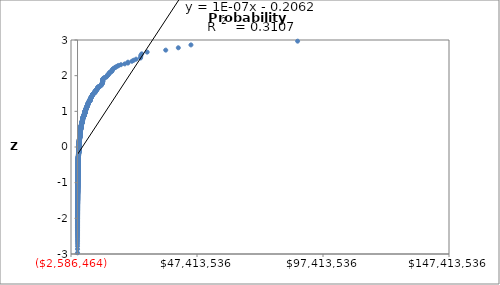
| Category | Normal Plot |
|---|---|
| 387.0 | -3.431 |
| 1362.0 | -3.121 |
| 1650.0 | -2.967 |
| 1860.0 | -2.862 |
| 5000.0 | -2.782 |
| 5000.0 | -2.716 |
| 5000.0 | -2.66 |
| 5000.0 | -2.612 |
| 5333.0 | -2.569 |
| 6000.0 | -2.53 |
| 7500.0 | -2.495 |
| 7629.0 | -2.462 |
| 9950.0 | -2.432 |
| 9999.0 | -2.404 |
| 10000.0 | -2.378 |
| 10000.0 | -2.353 |
| 10000.0 | -2.33 |
| 10000.0 | -2.308 |
| 10000.0 | -2.287 |
| 10000.0 | -2.266 |
| 10000.0 | -2.247 |
| 10000.0 | -2.229 |
| 10000.0 | -2.211 |
| 10000.0 | -2.194 |
| 10000.0 | -2.178 |
| 10000.0 | -2.162 |
| 10000.0 | -2.147 |
| 10000.0 | -2.132 |
| 10000.0 | -2.117 |
| 10000.0 | -2.103 |
| 10000.0 | -2.09 |
| 10000.0 | -2.077 |
| 10000.0 | -2.064 |
| 10000.0 | -2.051 |
| 10500.0 | -2.039 |
| 10500.0 | -2.027 |
| 12000.0 | -2.016 |
| 12327.0 | -2.004 |
| 13512.0 | -1.993 |
| 14657.0 | -1.982 |
| 14670.0 | -1.972 |
| 15000.0 | -1.961 |
| 15000.0 | -1.951 |
| 15213.0 | -1.941 |
| 15461.0 | -1.931 |
| 16100.0 | -1.922 |
| 17240.0 | -1.912 |
| 18750.0 | -1.903 |
| 19000.0 | -1.894 |
| 19490.0 | -1.885 |
| 20000.0 | -1.876 |
| 20000.0 | -1.867 |
| 20000.0 | -1.859 |
| 20000.0 | -1.85 |
| 21000.0 | -1.842 |
| 21000.0 | -1.834 |
| 21080.0 | -1.826 |
| 21563.0 | -1.818 |
| 22263.0 | -1.81 |
| 23000.0 | -1.802 |
| 23476.0 | -1.795 |
| 25000.0 | -1.787 |
| 25000.0 | -1.78 |
| 25000.0 | -1.773 |
| 25000.0 | -1.766 |
| 25000.0 | -1.758 |
| 25000.0 | -1.751 |
| 25000.0 | -1.744 |
| 25000.0 | -1.738 |
| 25000.0 | -1.731 |
| 25000.0 | -1.724 |
| 25000.0 | -1.718 |
| 25000.0 | -1.711 |
| 25000.0 | -1.704 |
| 25000.0 | -1.698 |
| 25000.0 | -1.692 |
| 25000.0 | -1.686 |
| 25000.0 | -1.679 |
| 26724.0 | -1.673 |
| 27473.0 | -1.667 |
| 27500.0 | -1.661 |
| 27727.0 | -1.655 |
| 27890.0 | -1.649 |
| 27945.0 | -1.643 |
| 30000.0 | -1.638 |
| 30000.0 | -1.632 |
| 30000.0 | -1.626 |
| 30000.0 | -1.621 |
| 30000.0 | -1.615 |
| 30250.0 | -1.609 |
| 35000.0 | -1.604 |
| 35000.0 | -1.599 |
| 35000.0 | -1.593 |
| 36018.0 | -1.588 |
| 36540.0 | -1.583 |
| 36540.0 | -1.577 |
| 38420.0 | -1.572 |
| 39280.0 | -1.567 |
| 39600.0 | -1.562 |
| 39900.0 | -1.557 |
| 40000.0 | -1.552 |
| 40000.0 | -1.547 |
| 40000.0 | -1.542 |
| 40000.0 | -1.537 |
| 40000.0 | -1.532 |
| 40100.0 | -1.527 |
| 40282.0 | -1.522 |
| 42000.0 | -1.518 |
| 42186.0 | -1.513 |
| 42500.0 | -1.508 |
| 47810.0 | -1.503 |
| 47902.0 | -1.499 |
| 48449.0 | -1.494 |
| 48907.0 | -1.49 |
| 49500.0 | -1.485 |
| 49531.0 | -1.481 |
| 49949.0 | -1.476 |
| 49996.0 | -1.472 |
| 50000.0 | -1.467 |
| 50000.0 | -1.463 |
| 50000.0 | -1.458 |
| 50000.0 | -1.454 |
| 50000.0 | -1.45 |
| 50000.0 | -1.445 |
| 50000.0 | -1.441 |
| 50000.0 | -1.437 |
| 50000.0 | -1.433 |
| 50000.0 | -1.428 |
| 50000.0 | -1.424 |
| 50000.0 | -1.42 |
| 50000.0 | -1.416 |
| 50000.0 | -1.412 |
| 50000.0 | -1.408 |
| 50000.0 | -1.404 |
| 50000.0 | -1.4 |
| 50000.0 | -1.396 |
| 50000.0 | -1.392 |
| 50000.0 | -1.388 |
| 50000.0 | -1.384 |
| 50000.0 | -1.38 |
| 50000.0 | -1.376 |
| 50000.0 | -1.372 |
| 50000.0 | -1.368 |
| 50000.0 | -1.365 |
| 50000.0 | -1.361 |
| 50000.0 | -1.357 |
| 50000.0 | -1.353 |
| 50000.0 | -1.349 |
| 50388.0 | -1.346 |
| 50527.0 | -1.342 |
| 51500.0 | -1.338 |
| 51700.0 | -1.335 |
| 53500.0 | -1.331 |
| 54000.0 | -1.327 |
| 56245.0 | -1.324 |
| 59100.0 | -1.32 |
| 60000.0 | -1.317 |
| 60000.0 | -1.313 |
| 60000.0 | -1.309 |
| 60000.0 | -1.306 |
| 60000.0 | -1.302 |
| 60614.0 | -1.299 |
| 61929.0 | -1.295 |
| 63300.0 | -1.292 |
| 64518.0 | -1.288 |
| 65000.0 | -1.285 |
| 66400.0 | -1.282 |
| 68500.0 | -1.278 |
| 68800.0 | -1.275 |
| 70000.0 | -1.271 |
| 70116.0 | -1.268 |
| 71166.0 | -1.265 |
| 74219.0 | -1.261 |
| 74290.0 | -1.258 |
| 74800.0 | -1.255 |
| 74871.0 | -1.251 |
| 74900.0 | -1.248 |
| 74963.0 | -1.245 |
| 74998.0 | -1.242 |
| 75000.0 | -1.238 |
| 75000.0 | -1.235 |
| 75000.0 | -1.232 |
| 75000.0 | -1.229 |
| 75000.0 | -1.225 |
| 75000.0 | -1.222 |
| 75000.0 | -1.219 |
| 75000.0 | -1.216 |
| 75000.0 | -1.213 |
| 75000.0 | -1.21 |
| 75000.0 | -1.206 |
| 75000.0 | -1.203 |
| 75000.0 | -1.2 |
| 75000.0 | -1.197 |
| 75000.0 | -1.194 |
| 75000.0 | -1.191 |
| 75000.0 | -1.188 |
| 75820.0 | -1.185 |
| 75970.0 | -1.182 |
| 77367.0 | -1.179 |
| 78200.0 | -1.176 |
| 79115.0 | -1.173 |
| 80000.0 | -1.17 |
| 80000.0 | -1.167 |
| 80000.0 | -1.164 |
| 80426.0 | -1.161 |
| 81000.0 | -1.158 |
| 82500.0 | -1.155 |
| 82800.0 | -1.152 |
| 85000.0 | -1.149 |
| 85000.0 | -1.146 |
| 86000.0 | -1.143 |
| 87028.0 | -1.141 |
| 88000.0 | -1.138 |
| 90000.0 | -1.135 |
| 90000.0 | -1.132 |
| 91200.0 | -1.129 |
| 91300.0 | -1.126 |
| 93000.0 | -1.123 |
| 93452.0 | -1.121 |
| 94500.0 | -1.118 |
| 96000.0 | -1.115 |
| 98223.0 | -1.112 |
| 99080.0 | -1.109 |
| 99400.0 | -1.107 |
| 99500.0 | -1.104 |
| 99858.0 | -1.101 |
| 99902.0 | -1.098 |
| 99964.0 | -1.096 |
| 99998.0 | -1.093 |
| 99999.0 | -1.09 |
| 100000.0 | -1.087 |
| 100000.0 | -1.085 |
| 100000.0 | -1.082 |
| 100000.0 | -1.079 |
| 100000.0 | -1.077 |
| 100000.0 | -1.074 |
| 100000.0 | -1.071 |
| 100000.0 | -1.069 |
| 100000.0 | -1.066 |
| 100000.0 | -1.063 |
| 100000.0 | -1.061 |
| 100000.0 | -1.058 |
| 100000.0 | -1.055 |
| 100000.0 | -1.053 |
| 100000.0 | -1.05 |
| 100000.0 | -1.047 |
| 100000.0 | -1.045 |
| 100000.0 | -1.042 |
| 100000.0 | -1.04 |
| 100000.0 | -1.037 |
| 100000.0 | -1.035 |
| 100000.0 | -1.032 |
| 100000.0 | -1.029 |
| 100000.0 | -1.027 |
| 100000.0 | -1.024 |
| 100000.0 | -1.022 |
| 100000.0 | -1.019 |
| 100000.0 | -1.017 |
| 100000.0 | -1.014 |
| 100000.0 | -1.012 |
| 100000.0 | -1.009 |
| 100000.0 | -1.007 |
| 100000.0 | -1.004 |
| 100000.0 | -1.002 |
| 100000.0 | -0.999 |
| 100000.0 | -0.997 |
| 100000.0 | -0.994 |
| 100000.0 | -0.992 |
| 100000.0 | -0.989 |
| 100000.0 | -0.987 |
| 100000.0 | -0.984 |
| 100000.0 | -0.982 |
| 100000.0 | -0.98 |
| 100000.0 | -0.977 |
| 100000.0 | -0.975 |
| 100000.0 | -0.972 |
| 100001.0 | -0.97 |
| 100001.0 | -0.967 |
| 100007.0 | -0.965 |
| 100034.0 | -0.963 |
| 100098.0 | -0.96 |
| 100239.0 | -0.958 |
| 103000.0 | -0.955 |
| 104000.0 | -0.953 |
| 105000.0 | -0.951 |
| 110000.0 | -0.948 |
| 110000.0 | -0.946 |
| 110610.0 | -0.944 |
| 110700.0 | -0.941 |
| 111042.0 | -0.939 |
| 111376.0 | -0.937 |
| 115000.0 | -0.934 |
| 115000.0 | -0.932 |
| 115000.0 | -0.93 |
| 115650.0 | -0.927 |
| 119823.0 | -0.925 |
| 120458.0 | -0.923 |
| 121638.0 | -0.92 |
| 122213.0 | -0.918 |
| 122404.0 | -0.916 |
| 122981.0 | -0.914 |
| 124200.0 | -0.911 |
| 124757.0 | -0.909 |
| 125000.0 | -0.907 |
| 125000.0 | -0.904 |
| 125000.0 | -0.902 |
| 125000.0 | -0.9 |
| 125000.0 | -0.898 |
| 125000.0 | -0.895 |
| 125000.0 | -0.893 |
| 125000.0 | -0.891 |
| 125104.0 | -0.889 |
| 125962.0 | -0.886 |
| 129150.0 | -0.884 |
| 131250.0 | -0.882 |
| 131417.0 | -0.88 |
| 132000.0 | -0.878 |
| 132907.0 | -0.875 |
| 134000.0 | -0.873 |
| 134281.0 | -0.871 |
| 135000.0 | -0.869 |
| 135001.0 | -0.867 |
| 136400.0 | -0.864 |
| 137500.0 | -0.862 |
| 139438.0 | -0.86 |
| 139950.0 | -0.858 |
| 140000.0 | -0.856 |
| 140000.0 | -0.853 |
| 140000.0 | -0.851 |
| 143600.0 | -0.849 |
| 143973.0 | -0.847 |
| 144650.0 | -0.845 |
| 144917.0 | -0.843 |
| 146221.0 | -0.841 |
| 146337.0 | -0.838 |
| 147920.0 | -0.836 |
| 149733.0 | -0.834 |
| 149950.0 | -0.832 |
| 150000.0 | -0.83 |
| 150000.0 | -0.828 |
| 150000.0 | -0.826 |
| 150000.0 | -0.824 |
| 150000.0 | -0.821 |
| 150000.0 | -0.819 |
| 150000.0 | -0.817 |
| 150000.0 | -0.815 |
| 150000.0 | -0.813 |
| 150000.0 | -0.811 |
| 150000.0 | -0.809 |
| 150000.0 | -0.807 |
| 150000.0 | -0.805 |
| 150000.0 | -0.803 |
| 150000.0 | -0.8 |
| 150000.0 | -0.798 |
| 150000.0 | -0.796 |
| 150000.0 | -0.794 |
| 150834.0 | -0.792 |
| 151019.0 | -0.79 |
| 151125.0 | -0.788 |
| 151200.0 | -0.786 |
| 151431.0 | -0.784 |
| 152232.0 | -0.782 |
| 152513.0 | -0.78 |
| 152900.0 | -0.778 |
| 154347.0 | -0.776 |
| 156000.0 | -0.774 |
| 158400.0 | -0.772 |
| 160400.0 | -0.77 |
| 160950.0 | -0.768 |
| 168755.0 | -0.766 |
| 170000.0 | -0.764 |
| 170000.0 | -0.762 |
| 170000.0 | -0.76 |
| 170023.0 | -0.758 |
| 171000.0 | -0.756 |
| 172000.0 | -0.754 |
| 175000.0 | -0.752 |
| 175000.0 | -0.75 |
| 175000.0 | -0.748 |
| 175000.0 | -0.746 |
| 175644.0 | -0.744 |
| 179482.0 | -0.742 |
| 179600.0 | -0.74 |
| 180000.0 | -0.738 |
| 180000.0 | -0.736 |
| 180000.0 | -0.734 |
| 182000.0 | -0.732 |
| 182600.0 | -0.73 |
| 185840.0 | -0.728 |
| 186792.0 | -0.726 |
| 187000.0 | -0.724 |
| 189275.0 | -0.722 |
| 189886.0 | -0.72 |
| 189956.0 | -0.718 |
| 191600.0 | -0.716 |
| 191950.0 | -0.714 |
| 195967.0 | -0.712 |
| 198206.0 | -0.71 |
| 198704.0 | -0.708 |
| 199665.0 | -0.706 |
| 199984.0 | -0.705 |
| 199990.0 | -0.703 |
| 200000.0 | -0.701 |
| 200000.0 | -0.699 |
| 200000.0 | -0.697 |
| 200000.0 | -0.695 |
| 200000.0 | -0.693 |
| 200000.0 | -0.691 |
| 200000.0 | -0.689 |
| 200000.0 | -0.687 |
| 200000.0 | -0.685 |
| 200000.0 | -0.683 |
| 200000.0 | -0.682 |
| 200000.0 | -0.68 |
| 200000.0 | -0.678 |
| 200000.0 | -0.676 |
| 200000.0 | -0.674 |
| 200000.0 | -0.672 |
| 200000.0 | -0.67 |
| 200000.0 | -0.668 |
| 200000.0 | -0.666 |
| 200000.0 | -0.665 |
| 200000.0 | -0.663 |
| 200000.0 | -0.661 |
| 200000.0 | -0.659 |
| 200000.0 | -0.657 |
| 200000.0 | -0.655 |
| 200001.0 | -0.653 |
| 200002.0 | -0.652 |
| 200360.0 | -0.65 |
| 200360.0 | -0.648 |
| 200800.0 | -0.646 |
| 201600.0 | -0.644 |
| 202500.0 | -0.642 |
| 204988.0 | -0.64 |
| 208000.0 | -0.639 |
| 208950.0 | -0.637 |
| 209200.0 | -0.635 |
| 210000.0 | -0.633 |
| 210000.0 | -0.631 |
| 210000.0 | -0.629 |
| 210000.0 | -0.628 |
| 210360.0 | -0.626 |
| 211795.0 | -0.624 |
| 212000.0 | -0.622 |
| 213000.0 | -0.62 |
| 213000.0 | -0.618 |
| 213750.0 | -0.617 |
| 214808.0 | -0.615 |
| 215000.0 | -0.613 |
| 215000.0 | -0.611 |
| 216000.0 | -0.609 |
| 217200.0 | -0.607 |
| 218567.0 | -0.606 |
| 221755.0 | -0.604 |
| 222000.0 | -0.602 |
| 224000.0 | -0.6 |
| 224030.0 | -0.598 |
| 225000.0 | -0.597 |
| 225000.0 | -0.595 |
| 227200.0 | -0.593 |
| 227352.0 | -0.591 |
| 228150.0 | -0.589 |
| 230000.0 | -0.588 |
| 231382.0 | -0.586 |
| 231846.0 | -0.584 |
| 234450.0 | -0.582 |
| 235000.0 | -0.581 |
| 235150.0 | -0.579 |
| 238080.0 | -0.577 |
| 238500.0 | -0.575 |
| 239796.0 | -0.573 |
| 240000.0 | -0.572 |
| 240000.0 | -0.57 |
| 241747.0 | -0.568 |
| 242000.0 | -0.566 |
| 242580.0 | -0.565 |
| 244733.0 | -0.563 |
| 244924.0 | -0.561 |
| 245534.0 | -0.559 |
| 246070.0 | -0.558 |
| 247333.0 | -0.556 |
| 247465.0 | -0.554 |
| 248250.0 | -0.552 |
| 248343.0 | -0.55 |
| 248760.0 | -0.549 |
| 249113.0 | -0.547 |
| 249290.0 | -0.545 |
| 249396.0 | -0.543 |
| 249445.0 | -0.542 |
| 249471.0 | -0.54 |
| 249482.0 | -0.538 |
| 249505.0 | -0.537 |
| 249612.0 | -0.535 |
| 249727.0 | -0.533 |
| 249808.0 | -0.531 |
| 249826.0 | -0.53 |
| 249830.0 | -0.528 |
| 249855.0 | -0.526 |
| 249939.0 | -0.524 |
| 249994.0 | -0.523 |
| 250000.0 | -0.521 |
| 250000.0 | -0.519 |
| 250000.0 | -0.518 |
| 250000.0 | -0.516 |
| 250000.0 | -0.514 |
| 250000.0 | -0.512 |
| 250000.0 | -0.511 |
| 250000.0 | -0.509 |
| 250000.0 | -0.507 |
| 250000.0 | -0.505 |
| 250000.0 | -0.504 |
| 250000.0 | -0.502 |
| 250000.0 | -0.5 |
| 250000.0 | -0.499 |
| 250000.0 | -0.497 |
| 250000.0 | -0.495 |
| 250000.0 | -0.494 |
| 250000.0 | -0.492 |
| 250000.0 | -0.49 |
| 250000.0 | -0.488 |
| 250000.0 | -0.487 |
| 250000.0 | -0.485 |
| 250000.0 | -0.483 |
| 250000.0 | -0.482 |
| 250000.0 | -0.48 |
| 250000.0 | -0.478 |
| 250000.0 | -0.477 |
| 250000.0 | -0.475 |
| 250000.0 | -0.473 |
| 250000.0 | -0.472 |
| 250000.0 | -0.47 |
| 250000.0 | -0.468 |
| 250000.0 | -0.467 |
| 250000.0 | -0.465 |
| 250000.0 | -0.463 |
| 250000.0 | -0.461 |
| 250000.0 | -0.46 |
| 250249.0 | -0.458 |
| 250400.0 | -0.456 |
| 250669.0 | -0.455 |
| 250675.0 | -0.453 |
| 253482.0 | -0.451 |
| 254400.0 | -0.45 |
| 255394.0 | -0.448 |
| 257675.0 | -0.446 |
| 259895.0 | -0.445 |
| 260000.0 | -0.443 |
| 260760.0 | -0.441 |
| 262003.0 | -0.44 |
| 262500.0 | -0.438 |
| 263400.0 | -0.437 |
| 264500.0 | -0.435 |
| 270000.0 | -0.433 |
| 270492.0 | -0.432 |
| 272914.0 | -0.43 |
| 275000.0 | -0.428 |
| 277044.0 | -0.427 |
| 281217.0 | -0.425 |
| 281800.0 | -0.423 |
| 285368.0 | -0.422 |
| 285714.0 | -0.42 |
| 286500.0 | -0.418 |
| 286600.0 | -0.417 |
| 289899.0 | -0.415 |
| 290939.0 | -0.413 |
| 291070.0 | -0.412 |
| 293024.0 | -0.41 |
| 296000.0 | -0.409 |
| 297045.0 | -0.407 |
| 297800.0 | -0.405 |
| 298000.0 | -0.404 |
| 298176.0 | -0.402 |
| 299263.0 | -0.4 |
| 299363.0 | -0.399 |
| 299444.0 | -0.397 |
| 299902.0 | -0.395 |
| 299985.0 | -0.394 |
| 300000.0 | -0.392 |
| 300000.0 | -0.391 |
| 300000.0 | -0.389 |
| 300000.0 | -0.387 |
| 300000.0 | -0.386 |
| 300000.0 | -0.384 |
| 300000.0 | -0.382 |
| 300000.0 | -0.381 |
| 300000.0 | -0.379 |
| 300000.0 | -0.378 |
| 300000.0 | -0.376 |
| 300000.0 | -0.374 |
| 300000.0 | -0.373 |
| 300000.0 | -0.371 |
| 300000.0 | -0.37 |
| 300000.0 | -0.368 |
| 300000.0 | -0.366 |
| 300000.0 | -0.365 |
| 300000.0 | -0.363 |
| 300000.0 | -0.362 |
| 300000.0 | -0.36 |
| 300000.0 | -0.358 |
| 300000.0 | -0.357 |
| 300000.0 | -0.355 |
| 300000.0 | -0.353 |
| 300000.0 | -0.352 |
| 300000.0 | -0.35 |
| 300000.0 | -0.349 |
| 300000.0 | -0.347 |
| 300000.0 | -0.345 |
| 300000.0 | -0.344 |
| 300000.0 | -0.342 |
| 300000.0 | -0.341 |
| 300000.0 | -0.339 |
| 300000.0 | -0.338 |
| 300000.0 | -0.336 |
| 300000.0 | -0.334 |
| 300000.0 | -0.333 |
| 300008.0 | -0.331 |
| 300013.0 | -0.33 |
| 300250.0 | -0.328 |
| 300653.0 | -0.326 |
| 301451.0 | -0.325 |
| 302425.0 | -0.323 |
| 306485.0 | -0.322 |
| 306500.0 | -0.32 |
| 308000.0 | -0.318 |
| 309554.0 | -0.317 |
| 310500.0 | -0.315 |
| 313000.0 | -0.314 |
| 314110.0 | -0.312 |
| 319450.0 | -0.311 |
| 320000.0 | -0.309 |
| 322500.0 | -0.307 |
| 325000.0 | -0.306 |
| 325000.0 | -0.304 |
| 328000.0 | -0.303 |
| 329034.0 | -0.301 |
| 330000.0 | -0.299 |
| 330008.0 | -0.298 |
| 330781.0 | -0.296 |
| 331512.0 | -0.295 |
| 331678.0 | -0.293 |
| 333860.0 | -0.292 |
| 334100.0 | -0.29 |
| 334610.0 | -0.288 |
| 337000.0 | -0.287 |
| 341000.0 | -0.285 |
| 342576.0 | -0.284 |
| 345592.0 | -0.282 |
| 345592.0 | -0.281 |
| 346644.0 | -0.279 |
| 348288.0 | -0.278 |
| 350000.0 | -0.276 |
| 350000.0 | -0.274 |
| 350000.0 | -0.273 |
| 350000.0 | -0.271 |
| 350000.0 | -0.27 |
| 350000.0 | -0.268 |
| 350238.0 | -0.267 |
| 350253.0 | -0.265 |
| 353977.0 | -0.263 |
| 354993.0 | -0.262 |
| 355460.0 | -0.26 |
| 356054.0 | -0.259 |
| 358915.0 | -0.257 |
| 361927.0 | -0.256 |
| 365000.0 | -0.254 |
| 369000.0 | -0.253 |
| 369623.0 | -0.251 |
| 370938.0 | -0.249 |
| 375000.0 | -0.248 |
| 375030.0 | -0.246 |
| 377646.0 | -0.245 |
| 378013.0 | -0.243 |
| 378500.0 | -0.242 |
| 383465.0 | -0.24 |
| 385801.0 | -0.239 |
| 386560.0 | -0.237 |
| 391089.0 | -0.236 |
| 395836.0 | -0.234 |
| 395931.0 | -0.232 |
| 396262.0 | -0.231 |
| 397036.0 | -0.229 |
| 397590.0 | -0.228 |
| 398534.0 | -0.226 |
| 398704.0 | -0.225 |
| 399471.0 | -0.223 |
| 399827.0 | -0.222 |
| 399953.0 | -0.22 |
| 399968.0 | -0.219 |
| 400000.0 | -0.217 |
| 400000.0 | -0.215 |
| 400000.0 | -0.214 |
| 400000.0 | -0.212 |
| 400000.0 | -0.211 |
| 400000.0 | -0.209 |
| 400000.0 | -0.208 |
| 400000.0 | -0.206 |
| 400000.0 | -0.205 |
| 400000.0 | -0.203 |
| 400000.0 | -0.202 |
| 400000.0 | -0.2 |
| 400000.0 | -0.199 |
| 400000.0 | -0.197 |
| 400366.0 | -0.195 |
| 400381.0 | -0.194 |
| 405698.0 | -0.192 |
| 417517.0 | -0.191 |
| 417697.0 | -0.189 |
| 420002.0 | -0.188 |
| 420632.0 | -0.186 |
| 423500.0 | -0.185 |
| 425000.0 | -0.183 |
| 425000.0 | -0.182 |
| 425000.0 | -0.18 |
| 427000.0 | -0.179 |
| 427000.0 | -0.177 |
| 430000.0 | -0.176 |
| 432898.0 | -0.174 |
| 436800.0 | -0.172 |
| 437807.0 | -0.171 |
| 442320.0 | -0.169 |
| 442884.0 | -0.168 |
| 445040.0 | -0.166 |
| 449300.0 | -0.165 |
| 449750.0 | -0.163 |
| 450000.0 | -0.162 |
| 450000.0 | -0.16 |
| 450000.0 | -0.159 |
| 450000.0 | -0.157 |
| 450000.0 | -0.156 |
| 450000.0 | -0.154 |
| 450000.0 | -0.153 |
| 450223.0 | -0.151 |
| 450675.0 | -0.15 |
| 455394.0 | -0.148 |
| 460000.0 | -0.147 |
| 464984.0 | -0.145 |
| 468433.0 | -0.144 |
| 468500.0 | -0.142 |
| 473573.0 | -0.14 |
| 475000.0 | -0.139 |
| 475000.0 | -0.137 |
| 475077.0 | -0.136 |
| 476553.0 | -0.134 |
| 476610.0 | -0.133 |
| 476683.0 | -0.131 |
| 477691.0 | -0.13 |
| 479000.0 | -0.128 |
| 479602.0 | -0.127 |
| 480000.0 | -0.125 |
| 481844.0 | -0.124 |
| 484948.0 | -0.122 |
| 487071.0 | -0.121 |
| 487475.0 | -0.119 |
| 490021.0 | -0.118 |
| 491310.0 | -0.116 |
| 494826.0 | -0.115 |
| 494933.0 | -0.113 |
| 494953.0 | -0.112 |
| 495337.0 | -0.11 |
| 496776.0 | -0.109 |
| 497499.0 | -0.107 |
| 497613.0 | -0.106 |
| 497639.0 | -0.104 |
| 497684.0 | -0.103 |
| 497752.0 | -0.101 |
| 497878.0 | -0.1 |
| 498055.0 | -0.098 |
| 498724.0 | -0.097 |
| 498857.0 | -0.095 |
| 499375.0 | -0.093 |
| 499547.0 | -0.092 |
| 499730.0 | -0.09 |
| 499783.0 | -0.089 |
| 499800.0 | -0.087 |
| 499951.0 | -0.086 |
| 499962.0 | -0.084 |
| 499989.0 | -0.083 |
| 499996.0 | -0.081 |
| 499997.0 | -0.08 |
| 500000.0 | -0.078 |
| 500000.0 | -0.077 |
| 500000.0 | -0.075 |
| 500000.0 | -0.074 |
| 500000.0 | -0.072 |
| 500000.0 | -0.071 |
| 500000.0 | -0.069 |
| 500000.0 | -0.068 |
| 500000.0 | -0.066 |
| 500000.0 | -0.065 |
| 500000.0 | -0.063 |
| 500000.0 | -0.062 |
| 500000.0 | -0.06 |
| 500000.0 | -0.059 |
| 500000.0 | -0.057 |
| 500000.0 | -0.056 |
| 500000.0 | -0.054 |
| 500000.0 | -0.053 |
| 500000.0 | -0.051 |
| 500000.0 | -0.05 |
| 500000.0 | -0.048 |
| 500000.0 | -0.047 |
| 500000.0 | -0.045 |
| 500000.0 | -0.044 |
| 500000.0 | -0.042 |
| 500000.0 | -0.041 |
| 500000.0 | -0.039 |
| 500000.0 | -0.038 |
| 500000.0 | -0.036 |
| 500000.0 | -0.035 |
| 500000.0 | -0.033 |
| 500000.0 | -0.032 |
| 500000.0 | -0.03 |
| 500000.0 | -0.029 |
| 500000.0 | -0.027 |
| 500000.0 | -0.026 |
| 500000.0 | -0.024 |
| 500000.0 | -0.023 |
| 500000.0 | -0.021 |
| 500000.0 | -0.02 |
| 500000.0 | -0.018 |
| 500000.0 | -0.017 |
| 500000.0 | -0.015 |
| 500000.0 | -0.014 |
| 500000.0 | -0.012 |
| 500000.0 | -0.011 |
| 500000.0 | -0.009 |
| 500000.0 | -0.008 |
| 500000.0 | -0.006 |
| 500125.0 | -0.005 |
| 500187.0 | -0.003 |
| 500422.0 | -0.002 |
| 500543.0 | 0 |
| 500906.0 | 0.002 |
| 501485.0 | 0.003 |
| 501580.0 | 0.005 |
| 505500.0 | 0.006 |
| 505533.0 | 0.008 |
| 506504.0 | 0.009 |
| 511359.0 | 0.011 |
| 513219.0 | 0.012 |
| 517500.0 | 0.014 |
| 517670.0 | 0.015 |
| 517860.0 | 0.017 |
| 520446.0 | 0.018 |
| 525000.0 | 0.02 |
| 526960.0 | 0.021 |
| 531131.0 | 0.023 |
| 538967.0 | 0.024 |
| 539334.0 | 0.026 |
| 540000.0 | 0.027 |
| 546864.0 | 0.029 |
| 549489.0 | 0.03 |
| 550000.0 | 0.032 |
| 550000.0 | 0.033 |
| 550000.0 | 0.035 |
| 550844.0 | 0.036 |
| 551336.0 | 0.038 |
| 553493.0 | 0.039 |
| 556006.0 | 0.041 |
| 557168.0 | 0.042 |
| 557743.0 | 0.044 |
| 558000.0 | 0.045 |
| 563611.0 | 0.047 |
| 566023.0 | 0.048 |
| 572533.0 | 0.05 |
| 574060.0 | 0.051 |
| 575000.0 | 0.053 |
| 576191.0 | 0.054 |
| 580000.0 | 0.056 |
| 582637.0 | 0.057 |
| 583531.0 | 0.059 |
| 583800.0 | 0.06 |
| 588559.0 | 0.062 |
| 594035.0 | 0.063 |
| 595627.0 | 0.065 |
| 595859.0 | 0.066 |
| 597077.0 | 0.068 |
| 597228.0 | 0.069 |
| 599016.0 | 0.071 |
| 599947.0 | 0.072 |
| 600000.0 | 0.074 |
| 600000.0 | 0.075 |
| 600000.0 | 0.077 |
| 600000.0 | 0.078 |
| 600000.0 | 0.08 |
| 600000.0 | 0.081 |
| 600000.0 | 0.083 |
| 600000.0 | 0.084 |
| 600000.0 | 0.086 |
| 600000.0 | 0.087 |
| 600000.0 | 0.089 |
| 600223.0 | 0.09 |
| 604973.0 | 0.092 |
| 606608.0 | 0.093 |
| 610819.0 | 0.095 |
| 614954.0 | 0.097 |
| 615590.0 | 0.098 |
| 621265.0 | 0.1 |
| 623035.0 | 0.101 |
| 625000.0 | 0.103 |
| 628761.0 | 0.104 |
| 635003.0 | 0.106 |
| 637532.0 | 0.107 |
| 637532.0 | 0.109 |
| 638620.0 | 0.11 |
| 642753.0 | 0.112 |
| 643881.0 | 0.113 |
| 646851.0 | 0.115 |
| 650000.0 | 0.116 |
| 650000.0 | 0.118 |
| 650000.0 | 0.119 |
| 650000.0 | 0.121 |
| 650000.0 | 0.122 |
| 650000.0 | 0.124 |
| 650000.0 | 0.125 |
| 650000.0 | 0.127 |
| 652255.0 | 0.128 |
| 652493.0 | 0.13 |
| 653077.0 | 0.131 |
| 659788.0 | 0.133 |
| 667235.0 | 0.134 |
| 670156.0 | 0.136 |
| 670387.0 | 0.137 |
| 671361.0 | 0.139 |
| 672000.0 | 0.14 |
| 674472.0 | 0.142 |
| 675000.0 | 0.144 |
| 675000.0 | 0.145 |
| 685000.0 | 0.147 |
| 686784.0 | 0.148 |
| 689738.0 | 0.15 |
| 697310.0 | 0.151 |
| 699104.0 | 0.153 |
| 700000.0 | 0.154 |
| 700000.0 | 0.156 |
| 700000.0 | 0.157 |
| 700250.0 | 0.159 |
| 703737.0 | 0.16 |
| 725000.0 | 0.162 |
| 726000.0 | 0.163 |
| 729916.0 | 0.165 |
| 733195.0 | 0.166 |
| 733793.0 | 0.168 |
| 742223.0 | 0.169 |
| 742996.0 | 0.171 |
| 743331.0 | 0.172 |
| 743550.0 | 0.174 |
| 744703.0 | 0.176 |
| 744844.0 | 0.177 |
| 750000.0 | 0.179 |
| 750000.0 | 0.18 |
| 750000.0 | 0.182 |
| 750000.0 | 0.183 |
| 750000.0 | 0.185 |
| 750000.0 | 0.186 |
| 750000.0 | 0.188 |
| 750000.0 | 0.189 |
| 750000.0 | 0.191 |
| 750000.0 | 0.192 |
| 750000.0 | 0.194 |
| 750000.0 | 0.195 |
| 750000.0 | 0.197 |
| 750000.0 | 0.199 |
| 750584.0 | 0.2 |
| 750772.0 | 0.202 |
| 753624.0 | 0.203 |
| 758910.0 | 0.205 |
| 760000.0 | 0.206 |
| 762476.0 | 0.208 |
| 768112.0 | 0.209 |
| 768794.0 | 0.211 |
| 775000.0 | 0.212 |
| 785194.0 | 0.214 |
| 791000.0 | 0.215 |
| 792216.0 | 0.217 |
| 797170.0 | 0.219 |
| 798160.0 | 0.22 |
| 798408.0 | 0.222 |
| 799221.0 | 0.223 |
| 799673.0 | 0.225 |
| 799759.0 | 0.226 |
| 799825.0 | 0.228 |
| 800000.0 | 0.229 |
| 800000.0 | 0.231 |
| 800000.0 | 0.232 |
| 800000.0 | 0.234 |
| 800000.0 | 0.236 |
| 800000.0 | 0.237 |
| 800000.0 | 0.239 |
| 800000.0 | 0.24 |
| 801808.0 | 0.242 |
| 809467.0 | 0.243 |
| 818471.0 | 0.245 |
| 820465.0 | 0.246 |
| 828653.0 | 0.248 |
| 831395.0 | 0.249 |
| 832969.0 | 0.251 |
| 837355.0 | 0.253 |
| 840000.0 | 0.254 |
| 840000.0 | 0.256 |
| 840000.0 | 0.257 |
| 850000.0 | 0.259 |
| 850000.0 | 0.26 |
| 850000.0 | 0.262 |
| 850000.0 | 0.263 |
| 855766.0 | 0.265 |
| 871202.0 | 0.267 |
| 871845.0 | 0.268 |
| 879000.0 | 0.27 |
| 879810.0 | 0.271 |
| 881000.0 | 0.273 |
| 883200.0 | 0.274 |
| 884417.0 | 0.276 |
| 885000.0 | 0.278 |
| 885130.0 | 0.279 |
| 886381.0 | 0.281 |
| 888638.0 | 0.282 |
| 892500.0 | 0.284 |
| 899021.0 | 0.285 |
| 899875.0 | 0.287 |
| 900000.0 | 0.288 |
| 900000.0 | 0.29 |
| 900000.0 | 0.292 |
| 900000.0 | 0.293 |
| 900000.0 | 0.295 |
| 900000.0 | 0.296 |
| 900000.0 | 0.298 |
| 900900.0 | 0.299 |
| 910000.0 | 0.301 |
| 911500.0 | 0.303 |
| 911500.0 | 0.304 |
| 920000.0 | 0.306 |
| 925111.0 | 0.307 |
| 931137.0 | 0.309 |
| 933529.0 | 0.311 |
| 937088.0 | 0.312 |
| 940148.0 | 0.314 |
| 942527.0 | 0.315 |
| 945261.0 | 0.317 |
| 950000.0 | 0.318 |
| 950000.0 | 0.32 |
| 950000.0 | 0.322 |
| 950548.0 | 0.323 |
| 951293.0 | 0.325 |
| 953184.0 | 0.326 |
| 959116.0 | 0.328 |
| 959373.0 | 0.33 |
| 959477.0 | 0.331 |
| 959989.0 | 0.333 |
| 960000.0 | 0.334 |
| 960000.0 | 0.336 |
| 965190.0 | 0.338 |
| 971421.0 | 0.339 |
| 973166.0 | 0.341 |
| 974941.0 | 0.342 |
| 975000.0 | 0.344 |
| 978105.0 | 0.345 |
| 979000.0 | 0.347 |
| 981000.0 | 0.349 |
| 986452.0 | 0.35 |
| 987000.0 | 0.352 |
| 987579.0 | 0.353 |
| 988320.0 | 0.355 |
| 989319.0 | 0.357 |
| 989929.0 | 0.358 |
| 992800.0 | 0.36 |
| 993219.0 | 0.362 |
| 993317.0 | 0.363 |
| 996185.0 | 0.365 |
| 997500.0 | 0.366 |
| 997614.0 | 0.368 |
| 998150.0 | 0.37 |
| 998221.0 | 0.371 |
| 999698.0 | 0.373 |
| 999795.0 | 0.374 |
| 999900.0 | 0.376 |
| 1000000.0 | 0.378 |
| 1000000.0 | 0.379 |
| 1000000.0 | 0.381 |
| 1000000.0 | 0.382 |
| 1000000.0 | 0.384 |
| 1000000.0 | 0.386 |
| 1000000.0 | 0.387 |
| 1000000.0 | 0.389 |
| 1000000.0 | 0.391 |
| 1000000.0 | 0.392 |
| 1000000.0 | 0.394 |
| 1000000.0 | 0.395 |
| 1000000.0 | 0.397 |
| 1000000.0 | 0.399 |
| 1000000.0 | 0.4 |
| 1000000.0 | 0.402 |
| 1000000.0 | 0.404 |
| 1000000.0 | 0.405 |
| 1000000.0 | 0.407 |
| 1000000.0 | 0.409 |
| 1000001.0 | 0.41 |
| 1000002.0 | 0.412 |
| 1000330.0 | 0.413 |
| 1000561.0 | 0.415 |
| 1001363.0 | 0.417 |
| 1002000.0 | 0.418 |
| 1004719.0 | 0.42 |
| 1021000.0 | 0.422 |
| 1038029.0 | 0.423 |
| 1047928.0 | 0.425 |
| 1053150.0 | 0.427 |
| 1058313.0 | 0.428 |
| 1068280.0 | 0.43 |
| 1070243.0 | 0.432 |
| 1076400.0 | 0.433 |
| 1077960.0 | 0.435 |
| 1095000.0 | 0.437 |
| 1099687.0 | 0.438 |
| 1100000.0 | 0.44 |
| 1100000.0 | 0.441 |
| 1111250.0 | 0.443 |
| 1112000.0 | 0.445 |
| 1116000.0 | 0.446 |
| 1118424.0 | 0.448 |
| 1123216.0 | 0.45 |
| 1125270.0 | 0.451 |
| 1137632.0 | 0.453 |
| 1144856.0 | 0.455 |
| 1150000.0 | 0.456 |
| 1153442.0 | 0.458 |
| 1159989.0 | 0.46 |
| 1163695.0 | 0.461 |
| 1168734.0 | 0.463 |
| 1175000.0 | 0.465 |
| 1179770.0 | 0.467 |
| 1181375.0 | 0.468 |
| 1189756.0 | 0.47 |
| 1194000.0 | 0.472 |
| 1195639.0 | 0.473 |
| 1200000.0 | 0.475 |
| 1200000.0 | 0.477 |
| 1200000.0 | 0.478 |
| 1200000.0 | 0.48 |
| 1200000.0 | 0.482 |
| 1200000.0 | 0.483 |
| 1200000.0 | 0.485 |
| 1200007.0 | 0.487 |
| 1205600.0 | 0.488 |
| 1221800.0 | 0.49 |
| 1224953.0 | 0.492 |
| 1229467.0 | 0.494 |
| 1229730.0 | 0.495 |
| 1233281.0 | 0.497 |
| 1235787.0 | 0.499 |
| 1243039.0 | 0.5 |
| 1245813.0 | 0.502 |
| 1249040.0 | 0.504 |
| 1250000.0 | 0.505 |
| 1254000.0 | 0.507 |
| 1255420.0 | 0.509 |
| 1255420.0 | 0.511 |
| 1257615.0 | 0.512 |
| 1261087.0 | 0.514 |
| 1271400.0 | 0.516 |
| 1293000.0 | 0.518 |
| 1293904.0 | 0.519 |
| 1300000.0 | 0.521 |
| 1300000.0 | 0.523 |
| 1300010.0 | 0.524 |
| 1303920.0 | 0.526 |
| 1307738.0 | 0.528 |
| 1309409.0 | 0.53 |
| 1312500.0 | 0.531 |
| 1348323.0 | 0.533 |
| 1350000.0 | 0.535 |
| 1357229.0 | 0.537 |
| 1365117.0 | 0.538 |
| 1365913.0 | 0.54 |
| 1370000.0 | 0.542 |
| 1397601.0 | 0.543 |
| 1400000.0 | 0.545 |
| 1418622.0 | 0.547 |
| 1422627.0 | 0.549 |
| 1425000.0 | 0.55 |
| 1439000.0 | 0.552 |
| 1439034.0 | 0.554 |
| 1440000.0 | 0.556 |
| 1440590.0 | 0.558 |
| 1445269.0 | 0.559 |
| 1449039.0 | 0.561 |
| 1453832.0 | 0.563 |
| 1463346.0 | 0.565 |
| 1464667.0 | 0.566 |
| 1465000.0 | 0.568 |
| 1465525.0 | 0.57 |
| 1470457.0 | 0.572 |
| 1475261.0 | 0.573 |
| 1498063.0 | 0.575 |
| 1500000.0 | 0.577 |
| 1500000.0 | 0.579 |
| 1500000.0 | 0.581 |
| 1500000.0 | 0.582 |
| 1500000.0 | 0.584 |
| 1500000.0 | 0.586 |
| 1500000.0 | 0.588 |
| 1500000.0 | 0.589 |
| 1500000.0 | 0.591 |
| 1500000.0 | 0.593 |
| 1500000.0 | 0.595 |
| 1500000.0 | 0.597 |
| 1500000.0 | 0.598 |
| 1500003.0 | 0.6 |
| 1500596.0 | 0.602 |
| 1501900.0 | 0.604 |
| 1508882.0 | 0.606 |
| 1511578.0 | 0.607 |
| 1511927.0 | 0.609 |
| 1521971.0 | 0.611 |
| 1540002.0 | 0.613 |
| 1541091.0 | 0.615 |
| 1544776.0 | 0.617 |
| 1550160.0 | 0.618 |
| 1557098.0 | 0.62 |
| 1570000.0 | 0.622 |
| 1572810.0 | 0.624 |
| 1576958.0 | 0.626 |
| 1577725.0 | 0.628 |
| 1579999.0 | 0.629 |
| 1590031.0 | 0.631 |
| 1596000.0 | 0.633 |
| 1600000.0 | 0.635 |
| 1600000.0 | 0.637 |
| 1602380.0 | 0.639 |
| 1603000.0 | 0.64 |
| 1603500.0 | 0.642 |
| 1605669.0 | 0.644 |
| 1612877.0 | 0.646 |
| 1616616.0 | 0.648 |
| 1619000.0 | 0.65 |
| 1631000.0 | 0.652 |
| 1635665.0 | 0.653 |
| 1640410.0 | 0.655 |
| 1659340.0 | 0.657 |
| 1663110.0 | 0.659 |
| 1680829.0 | 0.661 |
| 1683935.0 | 0.663 |
| 1694000.0 | 0.665 |
| 1694000.0 | 0.666 |
| 1696890.0 | 0.668 |
| 1697978.0 | 0.67 |
| 1700000.0 | 0.672 |
| 1700011.0 | 0.674 |
| 1715073.0 | 0.676 |
| 1719640.0 | 0.678 |
| 1726129.0 | 0.68 |
| 1729844.0 | 0.682 |
| 1747200.0 | 0.683 |
| 1747441.0 | 0.685 |
| 1749070.0 | 0.687 |
| 1750000.0 | 0.689 |
| 1752700.0 | 0.691 |
| 1778000.0 | 0.693 |
| 1779038.0 | 0.695 |
| 1784793.0 | 0.697 |
| 1798818.0 | 0.699 |
| 1800000.0 | 0.701 |
| 1800000.0 | 0.703 |
| 1800000.0 | 0.705 |
| 1800000.0 | 0.706 |
| 1800000.0 | 0.708 |
| 1819055.0 | 0.71 |
| 1847160.0 | 0.712 |
| 1849173.0 | 0.714 |
| 1864060.0 | 0.716 |
| 1882380.0 | 0.718 |
| 1894228.0 | 0.72 |
| 1900000.0 | 0.722 |
| 1900000.0 | 0.724 |
| 1929000.0 | 0.726 |
| 1935974.0 | 0.728 |
| 1939650.0 | 0.73 |
| 1957395.0 | 0.732 |
| 1958500.0 | 0.734 |
| 1972800.0 | 0.736 |
| 1975157.0 | 0.738 |
| 1975157.0 | 0.74 |
| 1980892.0 | 0.742 |
| 1981978.0 | 0.744 |
| 1987600.0 | 0.746 |
| 1989360.0 | 0.748 |
| 1995651.0 | 0.75 |
| 2000000.0 | 0.752 |
| 2000000.0 | 0.754 |
| 2000000.0 | 0.756 |
| 2000000.0 | 0.758 |
| 2000000.0 | 0.76 |
| 2000000.0 | 0.762 |
| 2000000.0 | 0.764 |
| 2000000.0 | 0.766 |
| 2000000.0 | 0.768 |
| 2000000.0 | 0.77 |
| 2000000.0 | 0.772 |
| 2000000.0 | 0.774 |
| 2000000.0 | 0.776 |
| 2000000.0 | 0.778 |
| 2000000.0 | 0.78 |
| 2002000.0 | 0.782 |
| 2025622.0 | 0.784 |
| 2025892.0 | 0.786 |
| 2033500.0 | 0.788 |
| 2039526.0 | 0.79 |
| 2046674.0 | 0.792 |
| 2051058.0 | 0.794 |
| 2082401.0 | 0.796 |
| 2084567.0 | 0.798 |
| 2100000.0 | 0.8 |
| 2100000.0 | 0.803 |
| 2100000.0 | 0.805 |
| 2110342.0 | 0.807 |
| 2112080.0 | 0.809 |
| 2119298.0 | 0.811 |
| 2131800.0 | 0.813 |
| 2148910.0 | 0.815 |
| 2148910.0 | 0.817 |
| 2156297.0 | 0.819 |
| 2173253.0 | 0.821 |
| 2184938.0 | 0.824 |
| 2210946.0 | 0.826 |
| 2217000.0 | 0.828 |
| 2237530.0 | 0.83 |
| 2241989.0 | 0.832 |
| 2250000.0 | 0.834 |
| 2268364.0 | 0.836 |
| 2274957.0 | 0.838 |
| 2296036.0 | 0.841 |
| 2300000.0 | 0.843 |
| 2374065.0 | 0.845 |
| 2401202.0 | 0.847 |
| 2415760.0 | 0.849 |
| 2423203.0 | 0.851 |
| 2423679.0 | 0.853 |
| 2441915.0 | 0.856 |
| 2446500.0 | 0.858 |
| 2494277.0 | 0.86 |
| 2500000.0 | 0.862 |
| 2500000.0 | 0.864 |
| 2500000.0 | 0.867 |
| 2500169.0 | 0.869 |
| 2502146.0 | 0.871 |
| 2506116.0 | 0.873 |
| 2520000.0 | 0.875 |
| 2520000.0 | 0.878 |
| 2540301.0 | 0.88 |
| 2565641.0 | 0.882 |
| 2577857.0 | 0.884 |
| 2597280.0 | 0.886 |
| 2600000.0 | 0.889 |
| 2605527.0 | 0.891 |
| 2610000.0 | 0.893 |
| 2628713.0 | 0.895 |
| 2641217.0 | 0.898 |
| 2645072.0 | 0.9 |
| 2649000.0 | 0.902 |
| 2650926.0 | 0.904 |
| 2652000.0 | 0.907 |
| 2658746.0 | 0.909 |
| 2683400.0 | 0.911 |
| 2694891.0 | 0.914 |
| 2699363.0 | 0.916 |
| 2700000.0 | 0.918 |
| 2719554.0 | 0.92 |
| 2722939.0 | 0.923 |
| 2736543.0 | 0.925 |
| 2749201.0 | 0.927 |
| 2750000.0 | 0.93 |
| 2761002.0 | 0.932 |
| 2849411.0 | 0.934 |
| 2882369.0 | 0.937 |
| 2899727.0 | 0.939 |
| 2901632.0 | 0.941 |
| 2914000.0 | 0.944 |
| 2934056.0 | 0.946 |
| 2935048.0 | 0.948 |
| 2940000.0 | 0.951 |
| 2950000.0 | 0.953 |
| 2950500.0 | 0.955 |
| 2968493.0 | 0.958 |
| 2968952.0 | 0.96 |
| 2970000.0 | 0.963 |
| 2989138.0 | 0.965 |
| 2999047.0 | 0.967 |
| 2999422.0 | 0.97 |
| 2999730.0 | 0.972 |
| 2999960.0 | 0.975 |
| 3000000.0 | 0.977 |
| 3000000.0 | 0.98 |
| 3000000.0 | 0.982 |
| 3000000.0 | 0.984 |
| 3000000.0 | 0.987 |
| 3000000.0 | 0.989 |
| 3000000.0 | 0.992 |
| 3000000.0 | 0.994 |
| 3000000.0 | 0.997 |
| 3000165.0 | 0.999 |
| 3000695.0 | 1.002 |
| 3004365.0 | 1.004 |
| 3024695.0 | 1.007 |
| 3079800.0 | 1.009 |
| 3086347.0 | 1.012 |
| 3095593.0 | 1.014 |
| 3114736.0 | 1.017 |
| 3120000.0 | 1.019 |
| 3179363.0 | 1.022 |
| 3187000.0 | 1.024 |
| 3197931.0 | 1.027 |
| 3200000.0 | 1.029 |
| 3200000.0 | 1.032 |
| 3200004.0 | 1.035 |
| 3204132.0 | 1.037 |
| 3213686.0 | 1.04 |
| 3230000.0 | 1.042 |
| 3243431.0 | 1.045 |
| 3249835.0 | 1.047 |
| 3264920.0 | 1.05 |
| 3265453.0 | 1.053 |
| 3295118.0 | 1.055 |
| 3325000.0 | 1.058 |
| 3349200.0 | 1.061 |
| 3360000.0 | 1.063 |
| 3380890.0 | 1.066 |
| 3427323.0 | 1.069 |
| 3427323.0 | 1.071 |
| 3468005.0 | 1.074 |
| 3476300.0 | 1.077 |
| 3487270.0 | 1.079 |
| 3498875.0 | 1.082 |
| 3500000.0 | 1.085 |
| 3500000.0 | 1.087 |
| 3500000.0 | 1.09 |
| 3500858.0 | 1.093 |
| 3520290.0 | 1.096 |
| 3525000.0 | 1.098 |
| 3547119.0 | 1.101 |
| 3578639.0 | 1.104 |
| 3595070.0 | 1.107 |
| 3600000.0 | 1.109 |
| 3600000.0 | 1.112 |
| 3613200.0 | 1.115 |
| 3615655.0 | 1.118 |
| 3632666.0 | 1.121 |
| 3640000.0 | 1.123 |
| 3714566.0 | 1.126 |
| 3743337.0 | 1.129 |
| 3768084.0 | 1.132 |
| 3772190.0 | 1.135 |
| 3774912.0 | 1.138 |
| 3775000.0 | 1.141 |
| 3779763.0 | 1.143 |
| 3878680.0 | 1.146 |
| 3882600.0 | 1.149 |
| 3920038.0 | 1.152 |
| 3950000.0 | 1.155 |
| 3950523.0 | 1.158 |
| 3956061.0 | 1.161 |
| 3998633.0 | 1.164 |
| 3999127.0 | 1.167 |
| 4000000.0 | 1.17 |
| 4000000.0 | 1.173 |
| 4000000.0 | 1.176 |
| 4000000.0 | 1.179 |
| 4000000.0 | 1.182 |
| 4000000.0 | 1.185 |
| 4000000.0 | 1.188 |
| 4000000.0 | 1.191 |
| 4000000.0 | 1.194 |
| 4001263.0 | 1.197 |
| 4021725.0 | 1.2 |
| 4030207.0 | 1.203 |
| 4079157.0 | 1.206 |
| 4079361.0 | 1.21 |
| 4110000.0 | 1.213 |
| 4114700.0 | 1.216 |
| 4200000.0 | 1.219 |
| 4200000.0 | 1.222 |
| 4290220.0 | 1.225 |
| 4326400.0 | 1.229 |
| 4336500.0 | 1.232 |
| 4342988.0 | 1.235 |
| 4353830.0 | 1.238 |
| 4371831.0 | 1.242 |
| 4425000.0 | 1.245 |
| 4430000.0 | 1.248 |
| 4463541.0 | 1.251 |
| 4475911.0 | 1.255 |
| 4476761.0 | 1.258 |
| 4500000.0 | 1.261 |
| 4500000.0 | 1.265 |
| 4500000.0 | 1.268 |
| 4511611.0 | 1.271 |
| 4560000.0 | 1.275 |
| 4665344.0 | 1.278 |
| 4800000.0 | 1.282 |
| 4808246.0 | 1.285 |
| 4837214.0 | 1.288 |
| 4850460.0 | 1.292 |
| 4873500.0 | 1.295 |
| 4934800.0 | 1.299 |
| 4974112.0 | 1.302 |
| 4989262.0 | 1.306 |
| 4992043.0 | 1.309 |
| 4998000.0 | 1.313 |
| 4999767.0 | 1.317 |
| 5000000.0 | 1.32 |
| 5000000.0 | 1.324 |
| 5000000.0 | 1.327 |
| 5000000.0 | 1.331 |
| 5000000.0 | 1.335 |
| 5100000.0 | 1.338 |
| 5100000.0 | 1.342 |
| 5115250.0 | 1.346 |
| 5150000.0 | 1.349 |
| 5151110.0 | 1.353 |
| 5151834.0 | 1.357 |
| 5189705.0 | 1.361 |
| 5197878.0 | 1.365 |
| 5218424.0 | 1.368 |
| 5226127.0 | 1.372 |
| 5283589.0 | 1.376 |
| 5339692.0 | 1.38 |
| 5339692.0 | 1.384 |
| 5411496.0 | 1.388 |
| 5420332.0 | 1.392 |
| 5482457.0 | 1.396 |
| 5483812.0 | 1.4 |
| 5499727.0 | 1.404 |
| 5511184.0 | 1.408 |
| 5542579.0 | 1.412 |
| 5549352.0 | 1.416 |
| 5603000.0 | 1.42 |
| 5620200.0 | 1.424 |
| 5664388.0 | 1.428 |
| 5727043.0 | 1.433 |
| 5760000.0 | 1.437 |
| 5799040.0 | 1.441 |
| 5901503.0 | 1.445 |
| 5907665.0 | 1.45 |
| 5908302.0 | 1.454 |
| 5914021.0 | 1.458 |
| 6000000.0 | 1.463 |
| 6000000.0 | 1.467 |
| 6000067.0 | 1.472 |
| 6000576.0 | 1.476 |
| 6080340.0 | 1.481 |
| 6094497.0 | 1.485 |
| 6122614.0 | 1.49 |
| 6300000.0 | 1.494 |
| 6336481.0 | 1.499 |
| 6500000.0 | 1.503 |
| 6550516.0 | 1.508 |
| 6750000.0 | 1.513 |
| 6752627.0 | 1.518 |
| 6861999.0 | 1.522 |
| 6900000.0 | 1.527 |
| 6929430.0 | 1.532 |
| 7000000.0 | 1.537 |
| 7000000.0 | 1.542 |
| 7000000.0 | 1.547 |
| 7000000.0 | 1.552 |
| 7000000.0 | 1.557 |
| 7023100.0 | 1.562 |
| 7023100.0 | 1.567 |
| 7030400.0 | 1.572 |
| 7090167.0 | 1.577 |
| 7351708.0 | 1.583 |
| 7500000.0 | 1.588 |
| 7559200.0 | 1.593 |
| 7611775.0 | 1.599 |
| 7613637.0 | 1.604 |
| 7662894.0 | 1.609 |
| 7697323.0 | 1.615 |
| 7750000.0 | 1.621 |
| 7750417.0 | 1.626 |
| 7910896.0 | 1.632 |
| 7913604.0 | 1.638 |
| 7945004.0 | 1.643 |
| 7999978.0 | 1.649 |
| 8000000.0 | 1.655 |
| 8003846.0 | 1.661 |
| 8062122.0 | 1.667 |
| 8089831.0 | 1.673 |
| 8149935.0 | 1.679 |
| 8300000.0 | 1.686 |
| 8474994.0 | 1.692 |
| 8873335.0 | 1.698 |
| 8959808.0 | 1.704 |
| 8999972.0 | 1.711 |
| 9000000.0 | 1.718 |
| 9364000.0 | 1.724 |
| 9382373.0 | 1.731 |
| 9388911.0 | 1.738 |
| 9446532.0 | 1.744 |
| 9490475.0 | 1.751 |
| 9602735.0 | 1.758 |
| 9675588.0 | 1.766 |
| 9707210.0 | 1.773 |
| 9800000.0 | 1.78 |
| 9800877.0 | 1.787 |
| 9856000.0 | 1.795 |
| 9900000.0 | 1.802 |
| 9900000.0 | 1.81 |
| 9961842.0 | 1.818 |
| 9967084.0 | 1.826 |
| 9984927.0 | 1.834 |
| 10000000.0 | 1.842 |
| 10000000.0 | 1.85 |
| 10000000.0 | 1.859 |
| 10000000.0 | 1.867 |
| 10000000.0 | 1.876 |
| 10000000.0 | 1.885 |
| 10000000.0 | 1.894 |
| 10000139.0 | 1.903 |
| 10119000.0 | 1.912 |
| 10300300.0 | 1.922 |
| 10355535.0 | 1.931 |
| 10562800.0 | 1.941 |
| 11013694.0 | 1.951 |
| 11437987.0 | 1.961 |
| 11480000.0 | 1.972 |
| 11521425.0 | 1.982 |
| 11750000.0 | 1.993 |
| 12000000.0 | 2.004 |
| 12000000.0 | 2.016 |
| 12000000.0 | 2.027 |
| 12207733.0 | 2.039 |
| 12500000.0 | 2.051 |
| 12567173.0 | 2.064 |
| 12660353.0 | 2.077 |
| 12704649.0 | 2.09 |
| 13115049.0 | 2.103 |
| 13568880.0 | 2.117 |
| 13669000.0 | 2.132 |
| 13675486.0 | 2.147 |
| 13763544.0 | 2.162 |
| 14000000.0 | 2.178 |
| 14130000.0 | 2.194 |
| 14518052.0 | 2.211 |
| 15000000.0 | 2.229 |
| 15206150.0 | 2.247 |
| 15860000.0 | 2.266 |
| 16294847.0 | 2.287 |
| 17250000.0 | 2.308 |
| 18743505.0 | 2.33 |
| 20000000.0 | 2.353 |
| 20000000.0 | 2.378 |
| 21574274.0 | 2.404 |
| 22262000.0 | 2.432 |
| 23239450.0 | 2.462 |
| 25000000.0 | 2.495 |
| 25085998.0 | 2.53 |
| 25106639.0 | 2.569 |
| 25464998.0 | 2.612 |
| 27640000.0 | 2.66 |
| 35000400.0 | 2.716 |
| 40000000.0 | 2.782 |
| 45012830.0 | 2.862 |
| 87333334.0 | 2.967 |
| 90000000.0 | 3.121 |
| 100000000.0 | 3.431 |